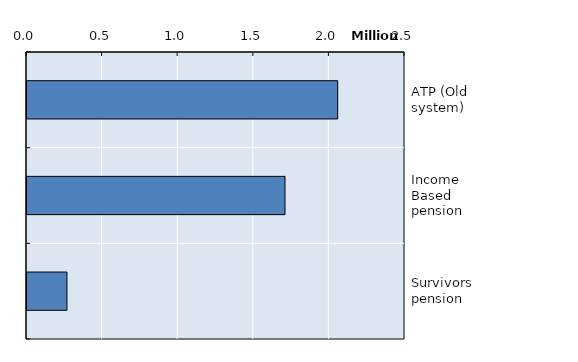
| Category | Series 0 |
|---|---|
| ATP (Old system) | 2054874 |
| Income Based pension | 1706426 |
| Survivors pension | 264194 |